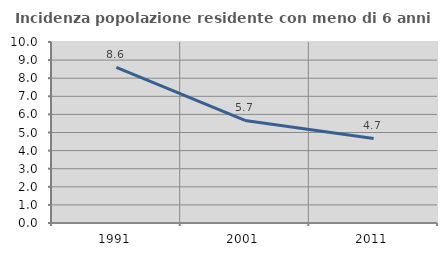
| Category | Incidenza popolazione residente con meno di 6 anni |
|---|---|
| 1991.0 | 8.597 |
| 2001.0 | 5.668 |
| 2011.0 | 4.674 |